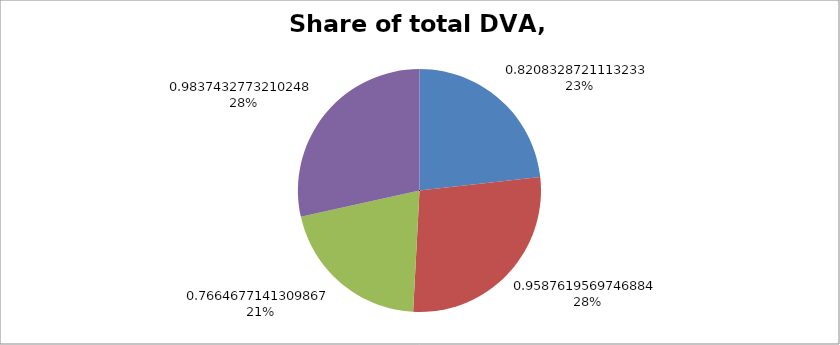
| Category | 0.668824076 |
|---|---|
| 0.8208328721113233 | 0.799 |
| 0.9587619569746884 | 0.949 |
| 0.7664677141309867 | 0.711 |
| 0.9837432773210248 | 0.979 |